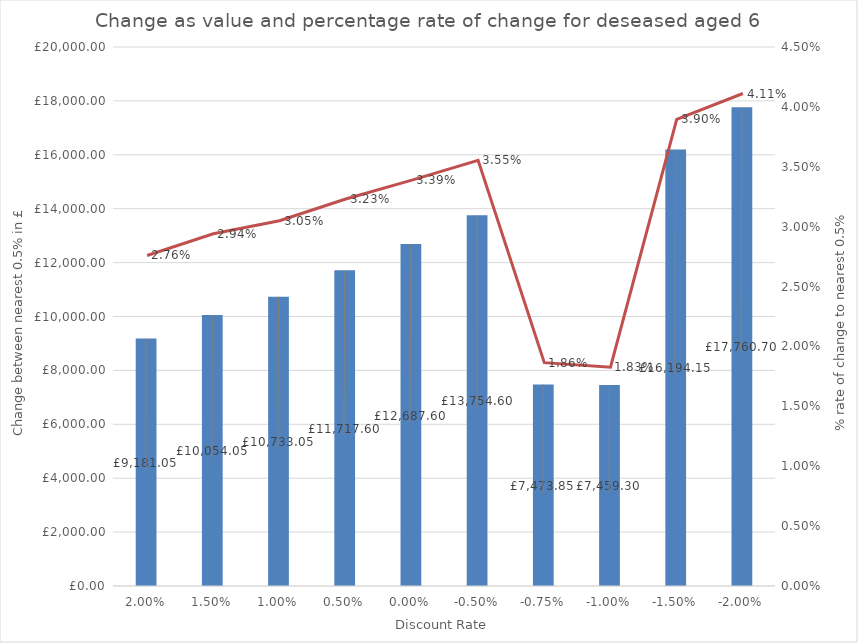
| Category | Value change |
|---|---|
| 0.02 | 9181.05 |
| 0.015 | 10054.05 |
| 0.01 | 10733.05 |
| 0.005 | 11717.6 |
| 0.0 | 12687.6 |
| -0.005 | 13754.6 |
| -0.0075 | 7473.85 |
| -0.01 | 7459.3 |
| -0.015 | 16194.15 |
| -0.02 | 17760.7 |